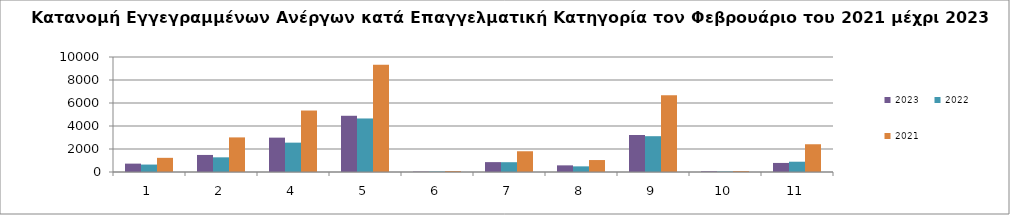
| Category | 2023 | 2022 | 2021 |
|---|---|---|---|
| 1.0 | 728 | 647 | 1232 |
| 2.0 | 1483 | 1276 | 3009 |
| 4.0 | 2988 | 2553 | 5345 |
| 5.0 | 4889 | 4655 | 9330 |
| 6.0 | 32 | 37 | 82 |
| 7.0 | 859 | 852 | 1804 |
| 8.0 | 578 | 491 | 1040 |
| 9.0 | 3219 | 3114 | 6683 |
| 10.0 | 60 | 40 | 81 |
| 11.0 | 788 | 895 | 2413 |